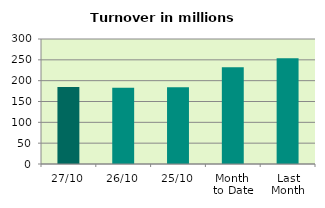
| Category | Series 0 |
|---|---|
| 27/10 | 184.557 |
| 26/10 | 182.798 |
| 25/10 | 184.297 |
| Month 
to Date | 232.054 |
| Last
Month | 253.961 |